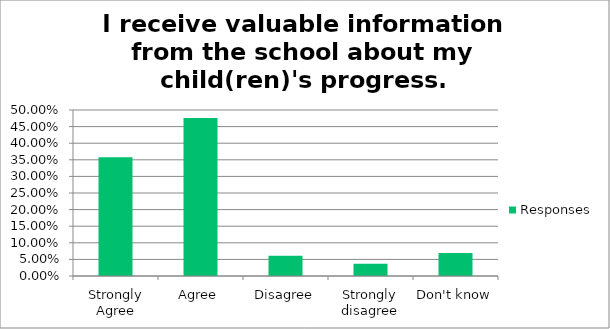
| Category | Responses |
|---|---|
| Strongly Agree | 0.358 |
| Agree | 0.476 |
| Disagree | 0.061 |
| Strongly disagree | 0.037 |
| Don't know | 0.069 |